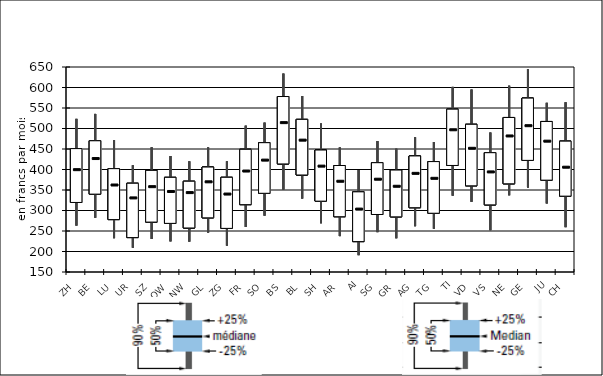
| Category | 25%-Quartil unten | 95% | 5% | 75%-Quartil oben |
|---|---|---|---|---|
| ZH | 319.6 | 523.543 | 263.2 | 450.979 |
| BE | 339.92 | 535.6 | 282.296 | 470.061 |
| LU | 277.8 | 471.803 | 232.436 | 402.086 |
| UR | 233.923 | 410.465 | 209.25 | 366.483 |
| SZ | 271.733 | 454.126 | 230.554 | 397.942 |
| OW | 268.602 | 432.95 | 224.718 | 380.94 |
| NW | 257.376 | 419.951 | 224.067 | 371.397 |
| GL | 282.1 | 453.956 | 246.139 | 406.006 |
| ZG | 256.399 | 420.047 | 214.307 | 381 |
| FR | 314.239 | 506.893 | 259.93 | 449.292 |
| SO | 341.965 | 514.336 | 287.481 | 465.4 |
| BS | 413.575 | 633.908 | 350.823 | 578.009 |
| BL | 386.6 | 579.266 | 329.1 | 522.299 |
| SH | 322.8 | 512.01 | 268.93 | 447.5 |
| AR | 284.8 | 453.844 | 237.5 | 409.719 |
| AI | 224.122 | 398.73 | 191.047 | 345.538 |
| SG | 290.263 | 469.429 | 247.198 | 416.586 |
| GR | 284.5 | 450.801 | 232.3 | 398.7 |
| AG | 306.778 | 478.546 | 261.657 | 433.056 |
| TG | 293.3 | 467.117 | 255.462 | 419.308 |
| TI | 409.854 | 601.502 | 336.2 | 547.2 |
| VD | 360.2 | 595.029 | 321.235 | 510.309 |
| VS | 313.7 | 490.156 | 251.829 | 441 |
| NE | 365.085 | 604.381 | 337.091 | 526.881 |
| GE | 422.22 | 644.998 | 355.893 | 574.188 |
| JU | 374 | 562.637 | 317.2 | 517.113 |
| CH | 335 | 563.98 | 259.328 | 469.2 |